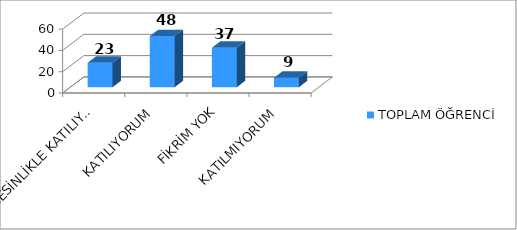
| Category | TOPLAM ÖĞRENCİ |
|---|---|
| KESİNLİKLE KATILIYORUM | 23 |
| KATILIYORUM | 48 |
| FİKRİM YOK | 37 |
| KATILMIYORUM | 9 |